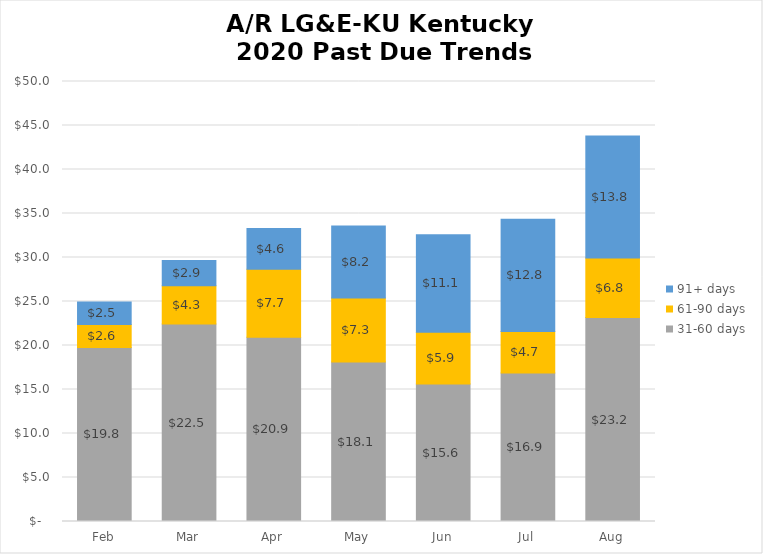
| Category | Total A/R | 0-30 days | 31-60 days | 61-90 days | 91+ days |
|---|---|---|---|---|---|
| Feb |  |  | 19.785 | 2.609 | 2.548 |
| Mar |  |  | 22.453 | 4.326 | 2.871 |
| Apr |  |  | 20.949 | 7.727 | 4.618 |
| May |  |  | 18.122 | 7.28 | 8.181 |
| Jun |  |  | 15.618 | 5.902 | 11.055 |
| Jul |  |  | 16.879 | 4.72 | 12.752 |
| Aug |  |  | 23.175 | 6.777 | 13.843 |